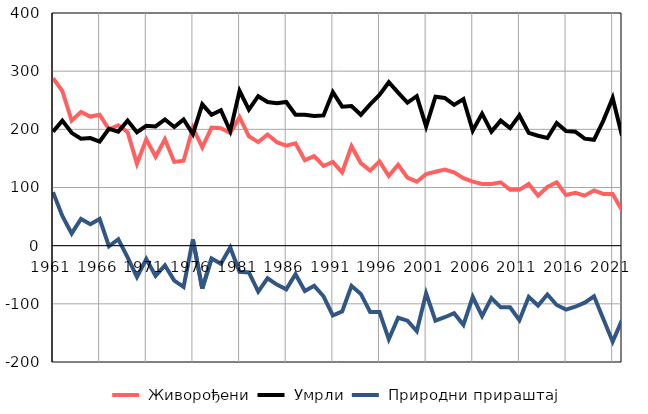
| Category |  Живорођени |  Умрли |  Природни прираштај |
|---|---|---|---|
| 1961.0 | 288 | 196 | 92 |
| 1962.0 | 266 | 215 | 51 |
| 1963.0 | 215 | 194 | 21 |
| 1964.0 | 230 | 184 | 46 |
| 1965.0 | 222 | 185 | 37 |
| 1966.0 | 225 | 179 | 46 |
| 1967.0 | 200 | 201 | -1 |
| 1968.0 | 207 | 196 | 11 |
| 1969.0 | 195 | 215 | -20 |
| 1970.0 | 141 | 195 | -54 |
| 1971.0 | 183 | 206 | -23 |
| 1972.0 | 153 | 205 | -52 |
| 1973.0 | 183 | 217 | -34 |
| 1974.0 | 144 | 204 | -60 |
| 1975.0 | 146 | 217 | -71 |
| 1976.0 | 203 | 192 | 11 |
| 1977.0 | 169 | 243 | -74 |
| 1978.0 | 203 | 225 | -22 |
| 1979.0 | 202 | 233 | -31 |
| 1980.0 | 194 | 197 | -3 |
| 1981.0 | 221 | 266 | -45 |
| 1982.0 | 188 | 234 | -46 |
| 1983.0 | 178 | 257 | -79 |
| 1984.0 | 191 | 247 | -56 |
| 1985.0 | 178 | 245 | -67 |
| 1986.0 | 172 | 247 | -75 |
| 1987.0 | 176 | 225 | -49 |
| 1988.0 | 147 | 225 | -78 |
| 1989.0 | 154 | 223 | -69 |
| 1990.0 | 137 | 224 | -87 |
| 1991.0 | 144 | 264 | -120 |
| 1992.0 | 126 | 239 | -113 |
| 1993.0 | 171 | 240 | -69 |
| 1994.0 | 142 | 225 | -83 |
| 1995.0 | 129 | 243 | -114 |
| 1996.0 | 145 | 259 | -114 |
| 1997.0 | 120 | 281 | -161 |
| 1998.0 | 139 | 263 | -124 |
| 1999.0 | 117 | 246 | -129 |
| 2000.0 | 110 | 257 | -147 |
| 2001.0 | 123 | 205 | -82 |
| 2002.0 | 127 | 256 | -129 |
| 2003.0 | 131 | 254 | -123 |
| 2004.0 | 126 | 242 | -116 |
| 2005.0 | 116 | 252 | -136 |
| 2006.0 | 110 | 198 | -88 |
| 2007.0 | 106 | 227 | -121 |
| 2008.0 | 106 | 196 | -90 |
| 2009.0 | 109 | 215 | -106 |
| 2010.0 | 96 | 202 | -106 |
| 2011.0 | 96 | 224 | -128 |
| 2012.0 | 106 | 194 | -88 |
| 2013.0 | 86 | 189 | -103 |
| 2014.0 | 101 | 185 | -84 |
| 2015.0 | 109 | 211 | -102 |
| 2016.0 | 87 | 197 | -110 |
| 2017.0 | 91 | 196 | -105 |
| 2018.0 | 86 | 184 | -98 |
| 2019.0 | 95 | 182 | -87 |
| 2020.0 | 89 | 215 | -126 |
| 2021.0 | 89 | 254 | -165 |
| 2022.0 | 61 | 189 | -128 |